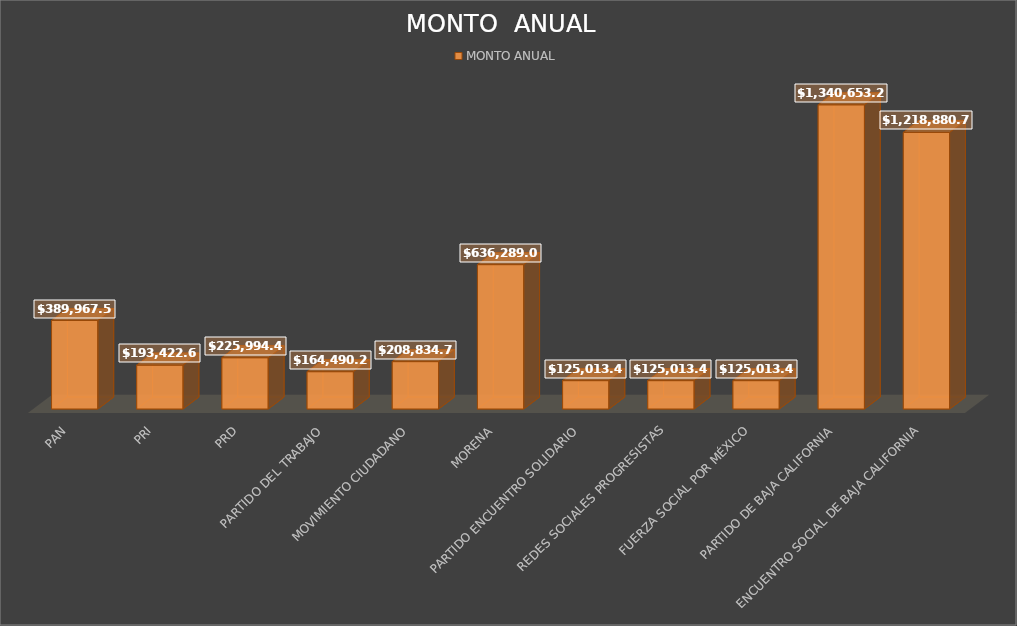
| Category | MONTO ANUAL |
|---|---|
| PAN | 389967.53 |
| PRI | 193422.62 |
| PRD | 225994.43 |
| PARTIDO DEL TRABAJO | 164490.25 |
| MOVIMIENTO CIUDADANO | 208834.7 |
| MORENA | 636289.01 |
| PARTIDO ENCUENTRO SOLIDARIO | 125013.41 |
| REDES SOCIALES PROGRESISTAS | 125013.41 |
| FUERZA SOCIAL POR MÉXICO | 125013.41 |
| PARTIDO DE BAJA CALIFORNIA | 1340653.21 |
| ENCUENTRO SOCIAL DE BAJA CALIFORNIA | 1218880.78 |